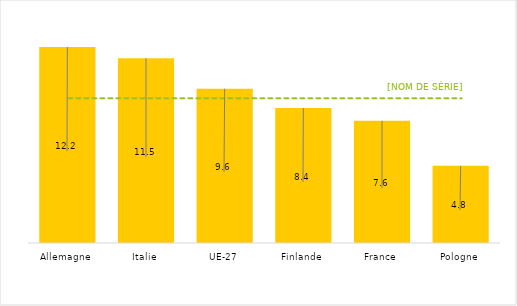
| Category | 2022 |
|---|---|
| Allemagne | 12.2 |
| Italie | 11.5 |
| UE-27 | 9.6 |
| Finlande | 8.4 |
| France | 7.6 |
| Pologne | 4.8 |